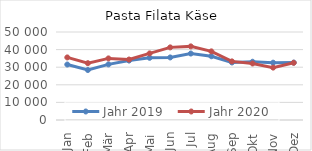
| Category | Jahr 2019 | Jahr 2020 |
|---|---|---|
| Jan | 31522.704 | 35552.258 |
| Feb | 28402.523 | 32283.703 |
| Mär | 31598.1 | 35000.12 |
| Apr | 33763.107 | 34355.803 |
| Mai | 35342.635 | 37829.123 |
| Jun | 35542.568 | 41266.705 |
| Jul | 37761.727 | 41828.888 |
| Aug | 36222.548 | 38992.986 |
| Sep | 32689.304 | 33307.349 |
| Okt | 33100.822 | 32115.861 |
| Nov | 32565.209 | 29762.458 |
| Dez | 32624.959 | 32504.429 |